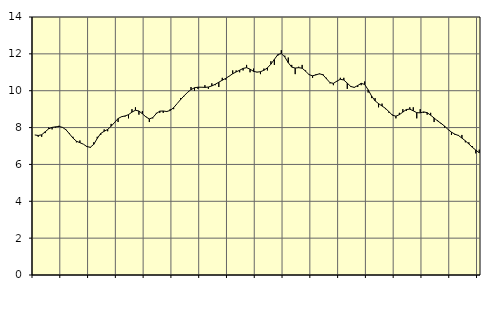
| Category | Piggar | Series 1 |
|---|---|---|
| nan | 7.6 | 7.6 |
| 87.0 | 7.5 | 7.57 |
| 87.0 | 7.5 | 7.61 |
| 87.0 | 7.7 | 7.77 |
| nan | 8 | 7.93 |
| 88.0 | 7.9 | 8.01 |
| 88.0 | 8 | 8.04 |
| 88.0 | 8.1 | 8.06 |
| nan | 8 | 8.01 |
| 89.0 | 7.9 | 7.88 |
| 89.0 | 7.7 | 7.66 |
| 89.0 | 7.5 | 7.43 |
| nan | 7.2 | 7.26 |
| 90.0 | 7.3 | 7.18 |
| 90.0 | 7.1 | 7.1 |
| 90.0 | 7 | 6.97 |
| nan | 6.9 | 6.93 |
| 91.0 | 7.2 | 7.09 |
| 91.0 | 7.5 | 7.41 |
| 91.0 | 7.6 | 7.68 |
| nan | 7.9 | 7.8 |
| 92.0 | 7.8 | 7.9 |
| 92.0 | 8.2 | 8.07 |
| 92.0 | 8.3 | 8.28 |
| nan | 8.3 | 8.49 |
| 93.0 | 8.6 | 8.59 |
| 93.0 | 8.6 | 8.63 |
| 93.0 | 8.5 | 8.7 |
| nan | 9 | 8.84 |
| 94.0 | 9.1 | 8.94 |
| 94.0 | 8.7 | 8.9 |
| 94.0 | 8.9 | 8.75 |
| nan | 8.6 | 8.58 |
| 95.0 | 8.3 | 8.47 |
| 95.0 | 8.5 | 8.54 |
| 95.0 | 8.8 | 8.76 |
| nan | 8.8 | 8.89 |
| 96.0 | 8.8 | 8.9 |
| 96.0 | 8.9 | 8.87 |
| 96.0 | 9 | 8.93 |
| nan | 9 | 9.08 |
| 97.0 | 9.3 | 9.3 |
| 97.0 | 9.6 | 9.52 |
| 97.0 | 9.7 | 9.72 |
| nan | 9.9 | 9.91 |
| 98.0 | 10.2 | 10.06 |
| 98.0 | 10 | 10.16 |
| 98.0 | 10.1 | 10.19 |
| nan | 10.2 | 10.19 |
| 99.0 | 10.3 | 10.18 |
| 99.0 | 10.1 | 10.2 |
| 99.0 | 10.4 | 10.26 |
| nan | 10.3 | 10.35 |
| 0.0 | 10.2 | 10.46 |
| 0.0 | 10.7 | 10.57 |
| 0.0 | 10.6 | 10.67 |
| nan | 10.8 | 10.79 |
| 1.0 | 11.1 | 10.92 |
| 1.0 | 11.1 | 11.02 |
| 1.0 | 11 | 11.11 |
| nan | 11.1 | 11.21 |
| 2.0 | 11.4 | 11.25 |
| 2.0 | 11 | 11.17 |
| 2.0 | 11.2 | 11.05 |
| nan | 11 | 11.01 |
| 3.0 | 10.9 | 11.03 |
| 3.0 | 11.2 | 11.11 |
| 3.0 | 11.1 | 11.24 |
| nan | 11.6 | 11.44 |
| 4.0 | 11.4 | 11.7 |
| 4.0 | 11.9 | 11.96 |
| 4.0 | 12.2 | 12.02 |
| nan | 11.9 | 11.83 |
| 5.0 | 11.8 | 11.52 |
| 5.0 | 11.4 | 11.28 |
| 5.0 | 10.9 | 11.23 |
| nan | 11.3 | 11.25 |
| 6.0 | 11.4 | 11.22 |
| 6.0 | 11.1 | 11.06 |
| 6.0 | 10.9 | 10.87 |
| nan | 10.7 | 10.81 |
| 7.0 | 10.9 | 10.86 |
| 7.0 | 10.9 | 10.92 |
| 7.0 | 10.9 | 10.86 |
| nan | 10.7 | 10.65 |
| 8.0 | 10.4 | 10.44 |
| 8.0 | 10.3 | 10.4 |
| 8.0 | 10.5 | 10.52 |
| nan | 10.7 | 10.62 |
| 9.0 | 10.7 | 10.58 |
| 9.0 | 10.1 | 10.41 |
| 9.0 | 10.2 | 10.23 |
| nan | 10.2 | 10.18 |
| 10.0 | 10.2 | 10.28 |
| 10.0 | 10.3 | 10.4 |
| 10.0 | 10.5 | 10.34 |
| nan | 9.9 | 10.05 |
| 11.0 | 9.6 | 9.71 |
| 11.0 | 9.6 | 9.45 |
| 11.0 | 9.1 | 9.3 |
| nan | 9.3 | 9.17 |
| 12.0 | 9 | 9.04 |
| 12.0 | 8.8 | 8.86 |
| 12.0 | 8.7 | 8.67 |
| nan | 8.5 | 8.62 |
| 13.0 | 8.8 | 8.7 |
| 13.0 | 9 | 8.84 |
| 13.0 | 8.9 | 8.98 |
| nan | 9.1 | 9 |
| 14.0 | 9.1 | 8.91 |
| 14.0 | 8.5 | 8.81 |
| 14.0 | 9 | 8.8 |
| nan | 8.8 | 8.85 |
| 15.0 | 8.7 | 8.81 |
| 15.0 | 8.8 | 8.67 |
| 15.0 | 8.3 | 8.52 |
| nan | 8.4 | 8.36 |
| 16.0 | 8.2 | 8.23 |
| 16.0 | 8 | 8.08 |
| 16.0 | 7.9 | 7.9 |
| nan | 7.6 | 7.75 |
| 17.0 | 7.6 | 7.64 |
| 17.0 | 7.6 | 7.57 |
| 17.0 | 7.6 | 7.43 |
| nan | 7.2 | 7.28 |
| 18.0 | 7.2 | 7.11 |
| 18.0 | 7 | 6.93 |
| 18.0 | 6.6 | 6.78 |
| nan | 6.8 | 6.63 |